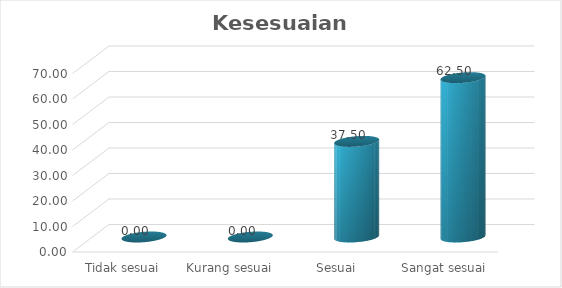
| Category | Kesesuaian Pelayanan |
|---|---|
| Tidak sesuai  | 0 |
| Kurang sesuai  | 0 |
| Sesuai | 37.5 |
| Sangat sesuai | 62.5 |